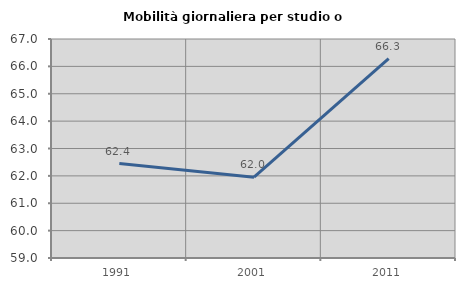
| Category | Mobilità giornaliera per studio o lavoro |
|---|---|
| 1991.0 | 62.449 |
| 2001.0 | 61.953 |
| 2011.0 | 66.287 |